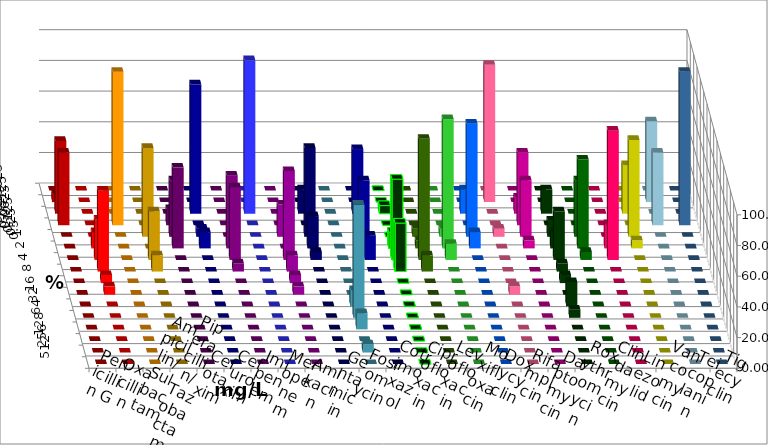
| Category | Penicillin G | Oxacillin | Ampicillin/ Sulbactam | Piperacillin/ Tazobactam | Cefotaxim | Cefuroxim | Imipenem | Meropenem | Amikacin | Gentamicin | Fosfomycin | Cotrimoxazol | Ciprofloxacin | Levofloxacin | Moxifloxacin | Doxycyclin | Rifampicin | Daptomycin | Roxythromycin | Clindamycin | Linezolid | Vancomycin | Teicoplanin | Tigecyclin |
|---|---|---|---|---|---|---|---|---|---|---|---|---|---|---|---|---|---|---|---|---|---|---|---|---|
| 0.015625 | 0 | 0 | 0 | 0 | 0 | 0 | 0 | 0 | 0 | 0 | 0 | 0 | 0 | 0 | 0 | 0 | 0 | 0 | 0 | 0 | 0 | 0 | 0 | 0 |
| 0.03125 | 5.263 | 0 | 0 | 0 | 0 | 0 | 0 | 0 | 0 | 0 | 0 | 0 | 0 | 0 | 0 | 0 | 89.474 | 0 | 0 | 0 | 0 | 0 | 0 | 52.632 |
| 0.0625 | 47.368 | 0 | 0 | 0 | 0 | 0 | 84.211 | 100 | 0 | 15.789 | 0 | 42.105 | 5.263 | 0 | 0 | 15.789 | 0 | 10.526 | 15.789 | 0 | 0 | 31.579 | 0 | 0 |
| 0.125 | 47.368 | 0 | 100 | 0 | 10.526 | 0 | 0 | 0 | 0 | 0 | 0 | 0 | 0 | 0 | 0 | 0 | 0 | 47.368 | 0 | 0 | 0 | 0 | 100 | 47.368 |
| 0.25 | 0 | 0 | 0 | 57.895 | 36.842 | 0 | 5.263 | 0 | 21.053 | 57.895 | 0 | 36.842 | 0 | 5.263 | 5.263 | 73.684 | 5.263 | 36.842 | 10.526 | 36.842 | 0 | 63.158 | 0 | 0 |
| 0.5 | 0 | 10.526 | 0 | 0 | 52.632 | 47.368 | 10.526 | 0 | 0 | 21.053 | 0 | 5.263 | 10.526 | 5.263 | 84.211 | 10.526 | 0 | 5.263 | 10.526 | 57.895 | 15.789 | 5.263 | 0 | 0 |
| 1.0 | 0 | 26.316 | 0 | 31.579 | 0 | 47.368 | 0 | 0 | 57.895 | 5.263 | 0 | 15.789 | 52.632 | 78.947 | 10.526 | 0 | 0 | 0 | 31.579 | 5.263 | 84.211 | 0 | 0 | 0 |
| 2.0 | 0 | 52.632 | 0 | 10.526 | 0 | 5.263 | 0 | 0 | 10.526 | 0 | 0 | 0 | 31.579 | 10.526 | 0 | 0 | 0 | 0 | 5.263 | 0 | 0 | 0 | 0 | 0 |
| 4.0 | 0 | 5.263 | 0 | 0 | 0 | 0 | 0 | 0 | 5.263 | 0 | 0 | 0 | 0 | 0 | 0 | 0 | 0 | 0 | 5.263 | 0 | 0 | 0 | 0 | 0 |
| 8.0 | 0 | 5.263 | 0 | 0 | 0 | 0 | 0 | 0 | 5.263 | 0 | 0 | 0 | 0 | 0 | 0 | 0 | 5.263 | 0 | 0 | 0 | 0 | 0 | 0 | 0 |
| 16.0 | 0 | 0 | 0 | 0 | 0 | 0 | 0 | 0 | 0 | 0 | 10.526 | 0 | 0 | 0 | 0 | 0 | 0 | 0 | 15.789 | 0 | 0 | 0 | 0 | 0 |
| 32.0 | 0 | 0 | 0 | 0 | 0 | 0 | 0 | 0 | 0 | 0 | 73.684 | 0 | 0 | 0 | 0 | 0 | 0 | 0 | 5.263 | 0 | 0 | 0 | 0 | 0 |
| 64.0 | 0 | 0 | 0 | 0 | 0 | 0 | 0 | 0 | 0 | 0 | 10.526 | 0 | 0 | 0 | 0 | 0 | 0 | 0 | 0 | 0 | 0 | 0 | 0 | 0 |
| 128.0 | 0 | 0 | 0 | 0 | 0 | 0 | 0 | 0 | 0 | 0 | 0 | 0 | 0 | 0 | 0 | 0 | 0 | 0 | 0 | 0 | 0 | 0 | 0 | 0 |
| 256.0 | 0 | 0 | 0 | 0 | 0 | 0 | 0 | 0 | 0 | 0 | 5.263 | 0 | 0 | 0 | 0 | 0 | 0 | 0 | 0 | 0 | 0 | 0 | 0 | 0 |
| 512.0 | 0 | 0 | 0 | 0 | 0 | 0 | 0 | 0 | 0 | 0 | 0 | 0 | 0 | 0 | 0 | 0 | 0 | 0 | 0 | 0 | 0 | 0 | 0 | 0 |